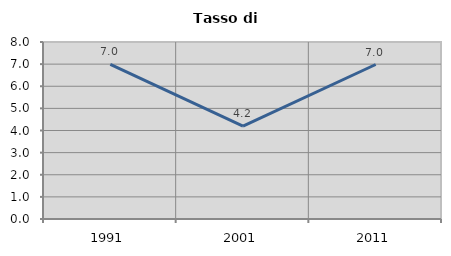
| Category | Tasso di disoccupazione   |
|---|---|
| 1991.0 | 6.985 |
| 2001.0 | 4.196 |
| 2011.0 | 6.983 |